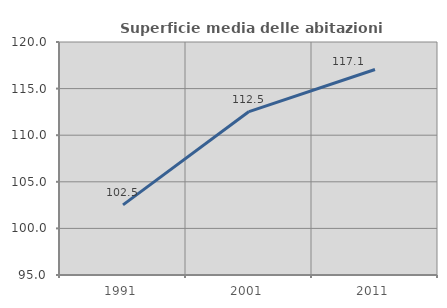
| Category | Superficie media delle abitazioni occupate |
|---|---|
| 1991.0 | 102.523 |
| 2001.0 | 112.534 |
| 2011.0 | 117.053 |